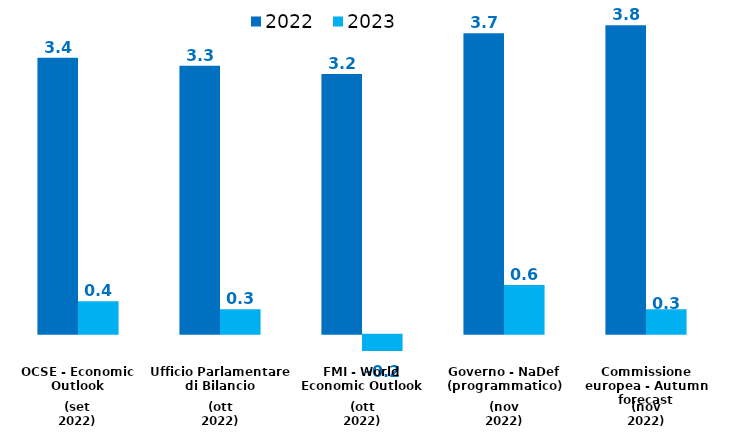
| Category | 2022 | 2023 |
|---|---|---|
| 0 | 3.4 | 0.4 |
| 1 | 3.3 | 0.3 |
| 2 | 3.2 | -0.2 |
| 3 | 3.7 | 0.6 |
| 4 | 3.8 | 0.3 |